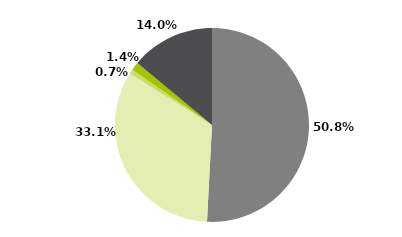
| Category | Series 0 |
|---|---|
| Multimercados Macro | 0.508 |
| Multimercados Livre | 0.331 |
| Multimercados L/S - Neutro | 0.007 |
| Multimercados L/S - Direcional | 0.014 |
| Outros | 0.14 |